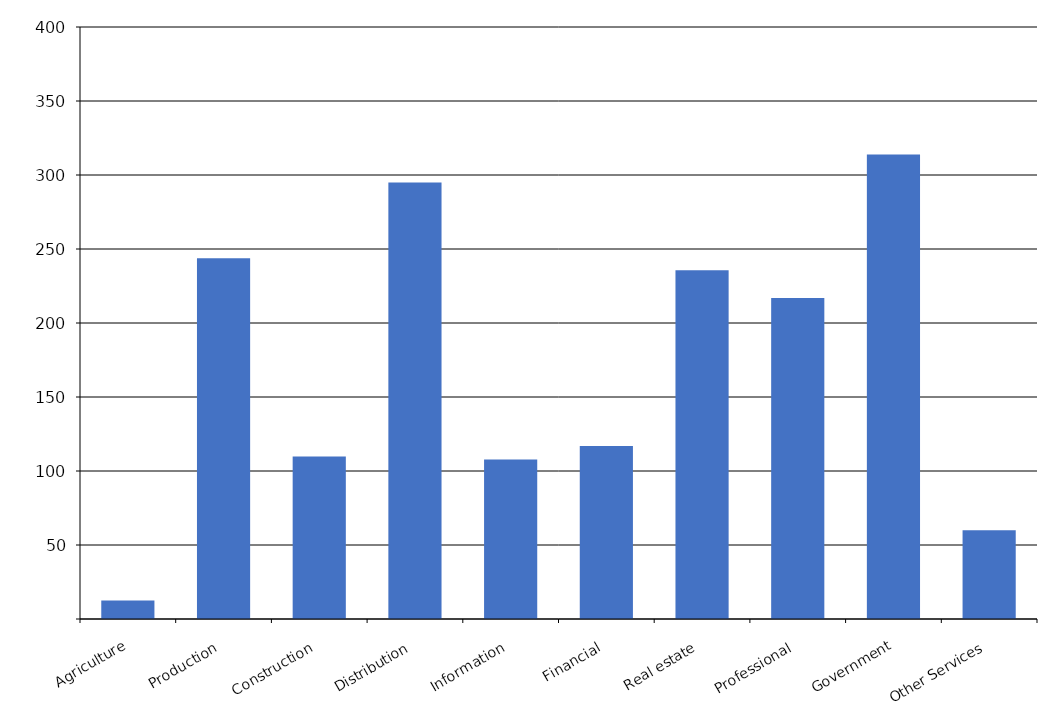
| Category | Series 0 |
|---|---|
| Agriculture | 12429 |
| Production | 243754 |
| Construction | 109842 |
| Distribution | 294966 |
| Information | 107819 |
| Financial | 116914 |
| Real estate | 235644 |
| Professional | 216830 |
| Government | 313926 |
| Other Services | 59948 |